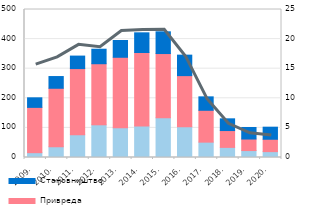
| Category | Остали сектори | Привреда | Становништво |
|---|---|---|---|
| 2009. | 16.3 | 153.043 | 32.3 |
| 2010. | 36.3 | 197.6 | 39.6 |
| 2011. | 77.1 | 223.3 | 42.2 |
| 2012. | 110.5 | 206.3 | 49 |
| 2013. | 100.2 | 238.4 | 56.7 |
| 2014. | 106.4 | 248.4 | 66.4 |
| 2015. | 134.4 | 216.8 | 73.4 |
| 2016. | 103.8 | 172.8 | 69.2 |
| 2017. | 51.9 | 107.6 | 45.4 |
| 2018. | 34.192 | 56.849 | 39.608 |
| 2019. | 23.45 | 38.949 | 39.017 |
| 2020. | 19.835 | 41.827 | 40.747 |